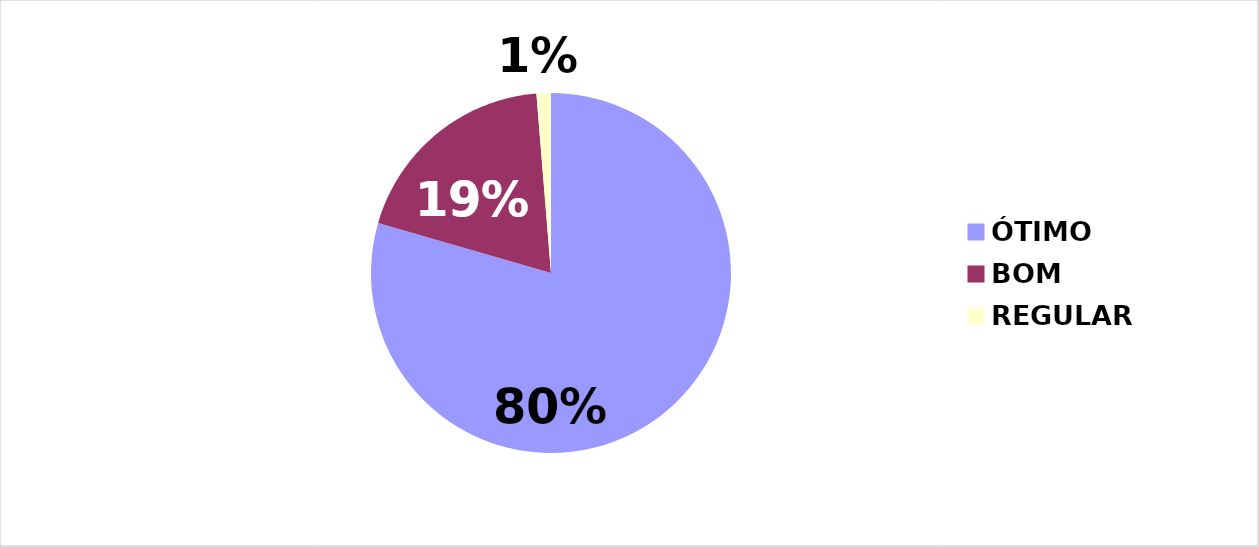
| Category | Series 0 |
|---|---|
| ÓTIMO | 79.453 |
| BOM | 19.21 |
| REGULAR | 1.293 |